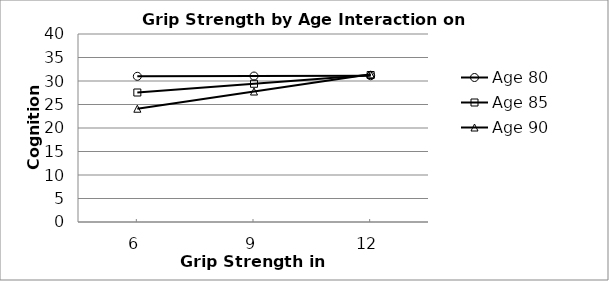
| Category | Age 80 | Age 85 | Age 90 |
|---|---|---|---|
| 6.0 | 31 | 27.55 | 24.1 |
| 9.0 | 31.06 | 29.41 | 27.76 |
| 12.0 | 31.12 | 31.27 | 31.42 |